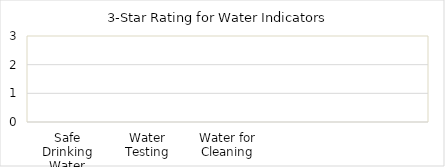
| Category | Series 0 |
|---|---|
| Safe Drinking Water | 0 |
| Water Testing | 0 |
| Water for Cleaning | 0 |